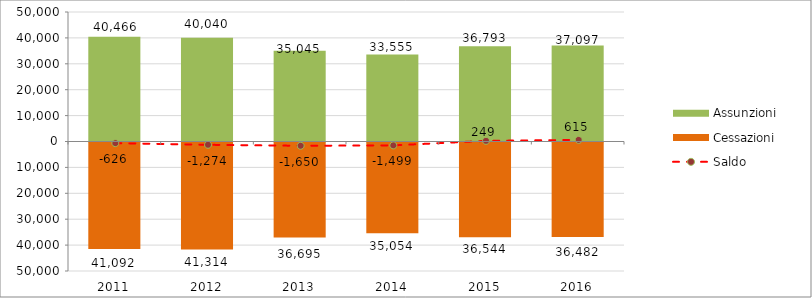
| Category | Assunzioni | Cessazioni |
|---|---|---|
| 2011.0 | 40466 | -41092 |
| 2012.0 | 40040 | -41314 |
| 2013.0 | 35045 | -36695 |
| 2014.0 | 33555 | -35054 |
| 2015.0 | 36793 | -36544 |
| 2016.0 | 37097 | -36482 |